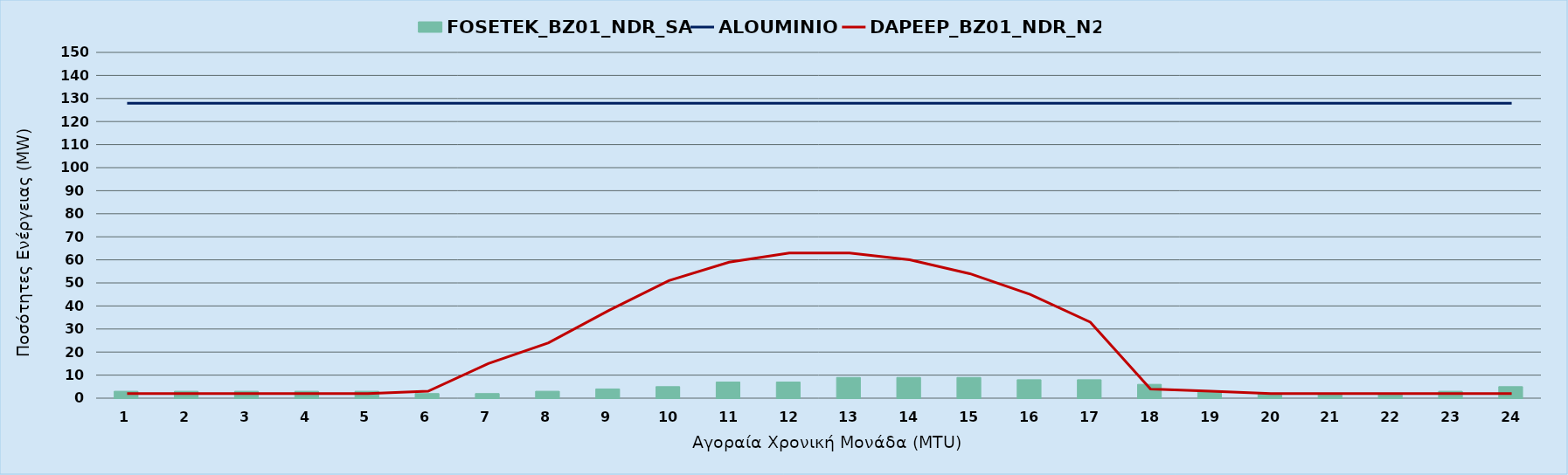
| Category | FOSETEK_BZ01_NDR_SA |
|---|---|
| 0 | 3 |
| 1 | 3 |
| 2 | 3 |
| 3 | 3 |
| 4 | 3 |
| 5 | 2 |
| 6 | 2 |
| 7 | 3 |
| 8 | 4 |
| 9 | 5 |
| 10 | 7 |
| 11 | 7 |
| 12 | 9 |
| 13 | 9 |
| 14 | 9 |
| 15 | 8 |
| 16 | 8 |
| 17 | 6 |
| 18 | 3 |
| 19 | 2 |
| 20 | 2 |
| 21 | 2 |
| 22 | 3 |
| 23 | 5 |